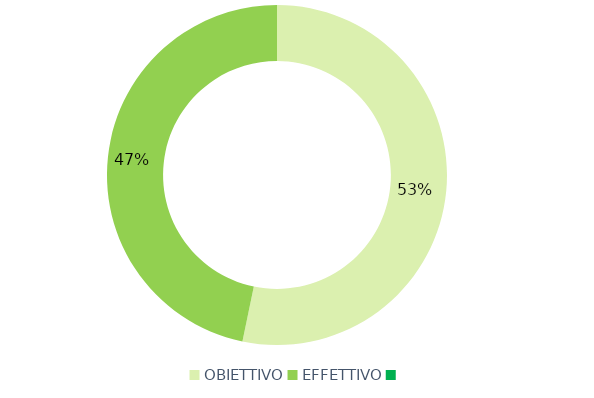
| Category | Series 0 |
|---|---|
| OBIETTIVO | 245 |
| EFFETTIVO | 215 |